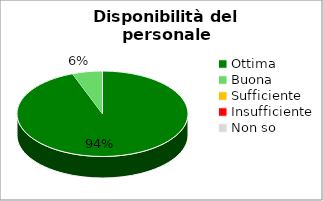
| Category | Disponibilità del personale di segreteria |
|---|---|
| Ottima | 33 |
| Buona | 2 |
| Sufficiente | 0 |
| Insufficiente | 0 |
| Non so | 0 |